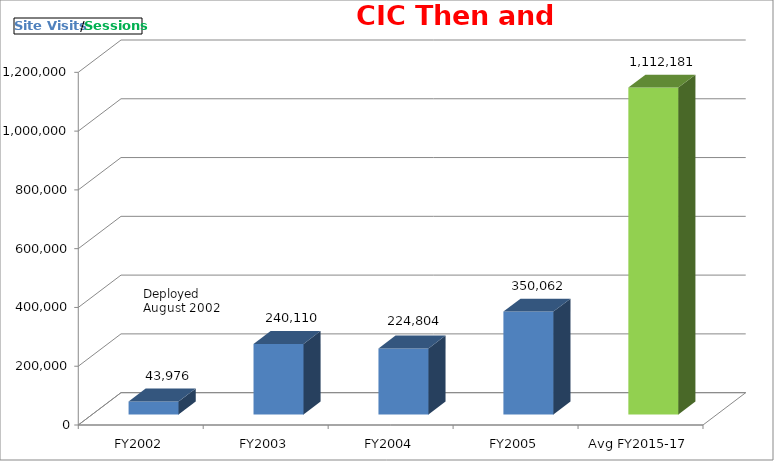
| Category | Series 0 |
|---|---|
| FY2002 | 43976 |
| FY2003 | 240110 |
| FY2004 | 224804 |
| FY2005 | 350062 |
| Avg FY2015-17 | 1112181 |